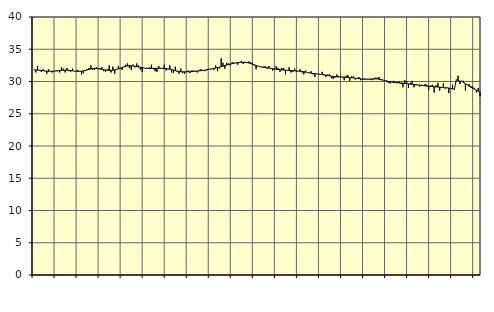
| Category | Piggar | Series 1 |
|---|---|---|
| nan | 31.8 | 31.82 |
| 1.0 | 31.4 | 31.79 |
| 1.0 | 32.4 | 31.76 |
| 1.0 | 31.7 | 31.74 |
| 1.0 | 31.5 | 31.71 |
| 1.0 | 31.9 | 31.68 |
| 1.0 | 31.6 | 31.64 |
| 1.0 | 31.2 | 31.61 |
| 1.0 | 31.9 | 31.59 |
| 1.0 | 31.6 | 31.58 |
| 1.0 | 31.4 | 31.58 |
| 1.0 | 31.6 | 31.6 |
| nan | 31.7 | 31.63 |
| 2.0 | 31.6 | 31.67 |
| 2.0 | 31.4 | 31.7 |
| 2.0 | 32.2 | 31.73 |
| 2.0 | 32 | 31.75 |
| 2.0 | 31.4 | 31.76 |
| 2.0 | 32.1 | 31.76 |
| 2.0 | 31.6 | 31.74 |
| 2.0 | 31.5 | 31.71 |
| 2.0 | 32 | 31.67 |
| 2.0 | 31.6 | 31.62 |
| 2.0 | 31.6 | 31.59 |
| nan | 31.8 | 31.58 |
| 3.0 | 31.6 | 31.58 |
| 3.0 | 31.1 | 31.61 |
| 3.0 | 31.3 | 31.66 |
| 3.0 | 31.7 | 31.73 |
| 3.0 | 31.9 | 31.8 |
| 3.0 | 32.1 | 31.88 |
| 3.0 | 32.5 | 31.95 |
| 3.0 | 31.8 | 32 |
| 3.0 | 31.8 | 32.03 |
| 3.0 | 32.2 | 32.03 |
| 3.0 | 31.9 | 32 |
| nan | 32.1 | 31.95 |
| 4.0 | 32.2 | 31.89 |
| 4.0 | 31.6 | 31.83 |
| 4.0 | 31.5 | 31.78 |
| 4.0 | 31.9 | 31.74 |
| 4.0 | 32.5 | 31.72 |
| 4.0 | 31.4 | 31.72 |
| 4.0 | 32.3 | 31.75 |
| 4.0 | 31.2 | 31.8 |
| 4.0 | 31.8 | 31.87 |
| 4.0 | 32.4 | 31.96 |
| 4.0 | 32 | 32.06 |
| nan | 31.8 | 32.17 |
| 5.0 | 32.3 | 32.27 |
| 5.0 | 32.6 | 32.35 |
| 5.0 | 32.8 | 32.41 |
| 5.0 | 32.1 | 32.45 |
| 5.0 | 31.8 | 32.44 |
| 5.0 | 32.6 | 32.41 |
| 5.0 | 32.2 | 32.36 |
| 5.0 | 32.8 | 32.3 |
| 5.0 | 32.5 | 32.24 |
| 5.0 | 31.8 | 32.19 |
| 5.0 | 31.5 | 32.14 |
| nan | 32.1 | 32.09 |
| 6.0 | 32.1 | 32.06 |
| 6.0 | 32.1 | 32.04 |
| 6.0 | 32.2 | 32.03 |
| 6.0 | 32.6 | 32.02 |
| 6.0 | 31.9 | 32.03 |
| 6.0 | 31.6 | 32.04 |
| 6.0 | 31.5 | 32.05 |
| 6.0 | 32.4 | 32.06 |
| 6.0 | 32 | 32.05 |
| 6.0 | 32.1 | 32.04 |
| 6.0 | 32.6 | 32.03 |
| nan | 31.7 | 32 |
| 7.0 | 31.9 | 31.96 |
| 7.0 | 32.5 | 31.91 |
| 7.0 | 31.4 | 31.84 |
| 7.0 | 31.3 | 31.76 |
| 7.0 | 32.3 | 31.68 |
| 7.0 | 31.5 | 31.61 |
| 7.0 | 31.2 | 31.56 |
| 7.0 | 32 | 31.53 |
| 7.0 | 31.3 | 31.5 |
| 7.0 | 31.2 | 31.49 |
| 7.0 | 31.6 | 31.5 |
| nan | 31.7 | 31.51 |
| 8.0 | 31.3 | 31.52 |
| 8.0 | 31.7 | 31.54 |
| 8.0 | 31.7 | 31.57 |
| 8.0 | 31.5 | 31.6 |
| 8.0 | 31.4 | 31.62 |
| 8.0 | 31.8 | 31.65 |
| 8.0 | 31.9 | 31.68 |
| 8.0 | 31.7 | 31.72 |
| 8.0 | 31.6 | 31.76 |
| 8.0 | 31.7 | 31.81 |
| 8.0 | 32 | 31.86 |
| nan | 31.9 | 31.91 |
| 9.0 | 32 | 31.96 |
| 9.0 | 31.8 | 32.02 |
| 9.0 | 32.5 | 32.08 |
| 9.0 | 31.6 | 32.15 |
| 9.0 | 32 | 32.22 |
| 9.0 | 33.6 | 32.3 |
| 9.0 | 32.9 | 32.38 |
| 9.0 | 32 | 32.47 |
| 9.0 | 32.9 | 32.55 |
| 9.0 | 32.8 | 32.63 |
| 9.0 | 32.5 | 32.71 |
| nan | 33 | 32.77 |
| 10.0 | 32.9 | 32.83 |
| 10.0 | 32.9 | 32.88 |
| 10.0 | 32.6 | 32.93 |
| 10.0 | 33 | 32.96 |
| 10.0 | 33.2 | 32.98 |
| 10.0 | 32.7 | 32.99 |
| 10.0 | 33 | 32.97 |
| 10.0 | 33 | 32.93 |
| 10.0 | 33.1 | 32.87 |
| 10.0 | 33 | 32.78 |
| 10.0 | 32.9 | 32.69 |
| nan | 32.5 | 32.59 |
| 11.0 | 31.9 | 32.49 |
| 11.0 | 32.4 | 32.4 |
| 11.0 | 32.3 | 32.32 |
| 11.0 | 32.2 | 32.26 |
| 11.0 | 32.3 | 32.2 |
| 11.0 | 32.4 | 32.16 |
| 11.0 | 32 | 32.12 |
| 11.0 | 32.4 | 32.08 |
| 11.0 | 32 | 32.04 |
| 11.0 | 31.7 | 32 |
| 11.0 | 31.8 | 31.95 |
| nan | 32.4 | 31.9 |
| 12.0 | 32.1 | 31.86 |
| 12.0 | 31.5 | 31.83 |
| 12.0 | 32.1 | 31.8 |
| 12.0 | 32.1 | 31.77 |
| 12.0 | 31.1 | 31.75 |
| 12.0 | 31.7 | 31.73 |
| 12.0 | 32.2 | 31.71 |
| 12.0 | 31.4 | 31.69 |
| 12.0 | 31.5 | 31.67 |
| 12.0 | 32 | 31.65 |
| 12.0 | 31.5 | 31.63 |
| nan | 31.6 | 31.61 |
| 13.0 | 31.9 | 31.59 |
| 13.0 | 31.4 | 31.55 |
| 13.0 | 31.1 | 31.51 |
| 13.0 | 31.7 | 31.45 |
| 13.0 | 31.4 | 31.4 |
| 13.0 | 31.3 | 31.34 |
| 13.0 | 31.6 | 31.29 |
| 13.0 | 31.1 | 31.25 |
| 13.0 | 30.7 | 31.21 |
| 13.0 | 31.2 | 31.18 |
| 13.0 | 31.1 | 31.15 |
| nan | 31.1 | 31.11 |
| 14.0 | 31.5 | 31.07 |
| 14.0 | 31.1 | 31.02 |
| 14.0 | 30.7 | 30.98 |
| 14.0 | 31.1 | 30.93 |
| 14.0 | 31.1 | 30.88 |
| 14.0 | 30.5 | 30.83 |
| 14.0 | 30.4 | 30.78 |
| 14.0 | 30.6 | 30.74 |
| 14.0 | 31.1 | 30.72 |
| 14.0 | 30.8 | 30.7 |
| 14.0 | 30.9 | 30.7 |
| nan | 30.6 | 30.69 |
| 15.0 | 30.2 | 30.68 |
| 15.0 | 30.9 | 30.66 |
| 15.0 | 31 | 30.64 |
| 15.0 | 30.1 | 30.61 |
| 15.0 | 30.8 | 30.58 |
| 15.0 | 30.8 | 30.55 |
| 15.0 | 30.3 | 30.51 |
| 15.0 | 30.5 | 30.48 |
| 15.0 | 30.7 | 30.45 |
| 15.0 | 30.2 | 30.41 |
| 15.0 | 30.3 | 30.38 |
| nan | 30.5 | 30.36 |
| 16.0 | 30.4 | 30.35 |
| 16.0 | 30.3 | 30.36 |
| 16.0 | 30.3 | 30.38 |
| 16.0 | 30.2 | 30.4 |
| 16.0 | 30.3 | 30.41 |
| 16.0 | 30.6 | 30.41 |
| 16.0 | 30.6 | 30.4 |
| 16.0 | 30.7 | 30.36 |
| 16.0 | 30.2 | 30.3 |
| 16.0 | 30.2 | 30.24 |
| 16.0 | 30.2 | 30.17 |
| nan | 30 | 30.09 |
| 17.0 | 29.8 | 30.02 |
| 17.0 | 29.7 | 29.96 |
| 17.0 | 29.9 | 29.9 |
| 17.0 | 30.1 | 29.86 |
| 17.0 | 29.9 | 29.83 |
| 17.0 | 29.9 | 29.8 |
| 17.0 | 30 | 29.78 |
| 17.0 | 29.6 | 29.76 |
| 17.0 | 29.1 | 29.73 |
| 17.0 | 30.2 | 29.7 |
| 17.0 | 30 | 29.66 |
| nan | 29 | 29.62 |
| 18.0 | 29.8 | 29.59 |
| 18.0 | 30.1 | 29.56 |
| 18.0 | 29.1 | 29.53 |
| 18.0 | 29.4 | 29.51 |
| 18.0 | 29.5 | 29.47 |
| 18.0 | 29.2 | 29.44 |
| 18.0 | 29.5 | 29.4 |
| 18.0 | 29.4 | 29.36 |
| 18.0 | 29.6 | 29.33 |
| 18.0 | 29.5 | 29.29 |
| 18.0 | 28.7 | 29.26 |
| nan | 29.4 | 29.24 |
| 19.0 | 29.5 | 29.22 |
| 19.0 | 28.3 | 29.19 |
| 19.0 | 29.4 | 29.17 |
| 19.0 | 29.8 | 29.14 |
| 19.0 | 28.6 | 29.12 |
| 19.0 | 29 | 29.09 |
| 19.0 | 29.7 | 29.06 |
| 19.0 | 28.9 | 29.04 |
| 19.0 | 29 | 29.02 |
| 19.0 | 28.2 | 28.98 |
| 19.0 | 28.9 | 28.93 |
| nan | 29.5 | 28.86 |
| 20.0 | 28.7 | 28.77 |
| 20.0 | 30.3 | 30.2 |
| 20.0 | 30.9 | 30.2 |
| 20.0 | 29.6 | 30.04 |
| 20.0 | 30.1 | 30.03 |
| 20.0 | 30.1 | 29.84 |
| 20.0 | 28.6 | 29.66 |
| 20.0 | 29.5 | 29.47 |
| 20.0 | 29.6 | 29.29 |
| 20.0 | 29.3 | 29.12 |
| 20.0 | 29.2 | 28.96 |
| nan | 28.9 | 28.81 |
| 21.0 | 28.3 | 28.65 |
| 21.0 | 29 | 28.5 |
| 21.0 | 27.7 | 28.36 |